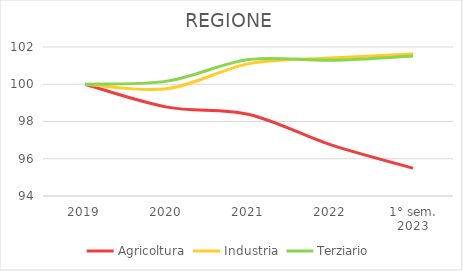
| Category | Agricoltura | Industria | Terziario |
|---|---|---|---|
| 2019 | 100 | 100 | 100 |
| 2020 | 98.773 | 99.756 | 100.168 |
| 2021 | 98.38 | 101.107 | 101.327 |
| 2022 | 96.743 | 101.408 | 101.286 |
| 1° sem.
2023 | 95.494 | 101.627 | 101.522 |